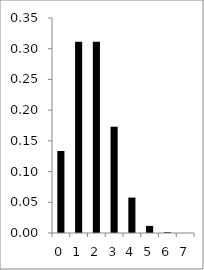
| Category | Series 0 |
|---|---|
| 0.0 | 0.133 |
| 1.0 | 0.311 |
| 2.0 | 0.311 |
| 3.0 | 0.173 |
| 4.0 | 0.058 |
| 5.0 | 0.012 |
| 6.0 | 0.001 |
| 7.0 | 0 |